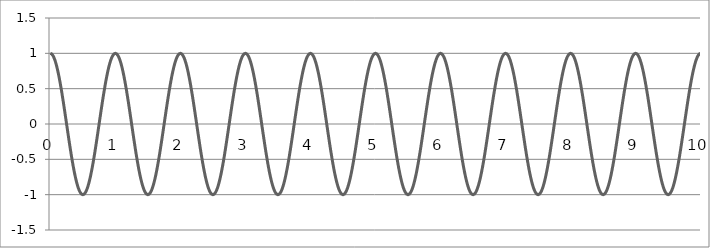
| Category | cos |
|---|---|
| 0.0 | 1 |
| 0.01 | 0.998 |
| 0.02 | 0.992 |
| 0.03 | 0.982 |
| 0.04 | 0.969 |
| 0.05 | 0.951 |
| 0.06 | 0.93 |
| 0.07 | 0.905 |
| 0.08 | 0.876 |
| 0.09 | 0.844 |
| 0.1 | 0.809 |
| 0.11 | 0.771 |
| 0.12 | 0.729 |
| 0.13 | 0.685 |
| 0.14 | 0.637 |
| 0.15 | 0.588 |
| 0.16 | 0.536 |
| 0.17 | 0.482 |
| 0.18 | 0.426 |
| 0.19 | 0.368 |
| 0.2 | 0.309 |
| 0.21 | 0.249 |
| 0.22 | 0.187 |
| 0.23 | 0.125 |
| 0.24 | 0.063 |
| 0.25 | 0 |
| 0.26 | -0.063 |
| 0.27 | -0.125 |
| 0.28 | -0.187 |
| 0.29 | -0.249 |
| 0.3 | -0.309 |
| 0.31 | -0.368 |
| 0.32 | -0.426 |
| 0.33 | -0.482 |
| 0.34 | -0.536 |
| 0.35 | -0.588 |
| 0.36 | -0.637 |
| 0.37 | -0.685 |
| 0.38 | -0.729 |
| 0.39 | -0.771 |
| 0.4 | -0.809 |
| 0.41 | -0.844 |
| 0.42 | -0.876 |
| 0.43 | -0.905 |
| 0.44 | -0.93 |
| 0.45 | -0.951 |
| 0.46 | -0.969 |
| 0.47 | -0.982 |
| 0.48 | -0.992 |
| 0.49 | -0.998 |
| 0.5 | -1 |
| 0.51 | -0.998 |
| 0.52 | -0.992 |
| 0.53 | -0.982 |
| 0.54 | -0.969 |
| 0.55 | -0.951 |
| 0.56 | -0.93 |
| 0.57 | -0.905 |
| 0.58 | -0.876 |
| 0.59 | -0.844 |
| 0.6 | -0.809 |
| 0.61 | -0.771 |
| 0.62 | -0.729 |
| 0.63 | -0.685 |
| 0.64 | -0.637 |
| 0.65 | -0.588 |
| 0.66 | -0.536 |
| 0.67 | -0.482 |
| 0.68 | -0.426 |
| 0.69 | -0.368 |
| 0.7 | -0.309 |
| 0.71 | -0.249 |
| 0.72 | -0.187 |
| 0.73 | -0.125 |
| 0.74 | -0.063 |
| 0.75 | 0 |
| 0.76 | 0.063 |
| 0.77 | 0.125 |
| 0.78 | 0.187 |
| 0.79 | 0.249 |
| 0.8 | 0.309 |
| 0.81 | 0.368 |
| 0.82 | 0.426 |
| 0.83 | 0.482 |
| 0.84 | 0.536 |
| 0.85 | 0.588 |
| 0.86 | 0.637 |
| 0.87 | 0.685 |
| 0.88 | 0.729 |
| 0.89 | 0.771 |
| 0.9 | 0.809 |
| 0.91 | 0.844 |
| 0.92 | 0.876 |
| 0.93 | 0.905 |
| 0.94 | 0.93 |
| 0.95 | 0.951 |
| 0.96 | 0.969 |
| 0.97 | 0.982 |
| 0.98 | 0.992 |
| 0.99 | 0.998 |
| 1.0 | 1 |
| 1.01 | 0.998 |
| 1.02 | 0.992 |
| 1.03 | 0.982 |
| 1.04 | 0.969 |
| 1.05 | 0.951 |
| 1.06 | 0.93 |
| 1.07 | 0.905 |
| 1.08 | 0.876 |
| 1.09 | 0.844 |
| 1.1 | 0.809 |
| 1.11 | 0.771 |
| 1.12 | 0.729 |
| 1.13 | 0.685 |
| 1.14 | 0.637 |
| 1.15 | 0.588 |
| 1.16 | 0.536 |
| 1.17 | 0.482 |
| 1.18 | 0.426 |
| 1.19 | 0.368 |
| 1.2 | 0.309 |
| 1.21 | 0.249 |
| 1.22 | 0.187 |
| 1.23 | 0.125 |
| 1.24 | 0.063 |
| 1.25 | 0 |
| 1.26 | -0.063 |
| 1.27 | -0.125 |
| 1.28 | -0.187 |
| 1.29 | -0.249 |
| 1.3 | -0.309 |
| 1.31 | -0.368 |
| 1.32 | -0.426 |
| 1.33 | -0.482 |
| 1.34 | -0.536 |
| 1.35 | -0.588 |
| 1.36 | -0.637 |
| 1.37 | -0.685 |
| 1.38 | -0.729 |
| 1.39 | -0.771 |
| 1.4 | -0.809 |
| 1.41 | -0.844 |
| 1.42 | -0.876 |
| 1.43 | -0.905 |
| 1.44 | -0.93 |
| 1.45 | -0.951 |
| 1.46 | -0.969 |
| 1.47 | -0.982 |
| 1.48 | -0.992 |
| 1.49 | -0.998 |
| 1.5 | -1 |
| 1.51 | -0.998 |
| 1.52 | -0.992 |
| 1.53 | -0.982 |
| 1.54 | -0.969 |
| 1.55 | -0.951 |
| 1.56 | -0.93 |
| 1.57 | -0.905 |
| 1.58 | -0.876 |
| 1.59 | -0.844 |
| 1.6 | -0.809 |
| 1.61 | -0.771 |
| 1.62 | -0.729 |
| 1.63 | -0.685 |
| 1.64 | -0.637 |
| 1.65 | -0.588 |
| 1.66 | -0.536 |
| 1.67 | -0.482 |
| 1.68 | -0.426 |
| 1.69 | -0.368 |
| 1.7 | -0.309 |
| 1.71 | -0.249 |
| 1.72 | -0.187 |
| 1.73 | -0.125 |
| 1.74 | -0.063 |
| 1.75 | 0 |
| 1.76 | 0.063 |
| 1.77 | 0.125 |
| 1.78 | 0.187 |
| 1.79 | 0.249 |
| 1.8 | 0.309 |
| 1.81 | 0.368 |
| 1.82 | 0.426 |
| 1.83 | 0.482 |
| 1.84 | 0.536 |
| 1.85 | 0.588 |
| 1.86 | 0.637 |
| 1.87 | 0.685 |
| 1.88 | 0.729 |
| 1.89 | 0.771 |
| 1.9 | 0.809 |
| 1.91 | 0.844 |
| 1.92 | 0.876 |
| 1.93 | 0.905 |
| 1.94 | 0.93 |
| 1.95 | 0.951 |
| 1.96 | 0.969 |
| 1.97 | 0.982 |
| 1.98 | 0.992 |
| 1.99 | 0.998 |
| 2.0 | 1 |
| 2.01 | 0.998 |
| 2.02 | 0.992 |
| 2.03 | 0.982 |
| 2.04 | 0.969 |
| 2.05 | 0.951 |
| 2.06 | 0.93 |
| 2.07 | 0.905 |
| 2.08 | 0.876 |
| 2.09 | 0.844 |
| 2.1 | 0.809 |
| 2.11 | 0.771 |
| 2.12 | 0.729 |
| 2.13 | 0.685 |
| 2.14 | 0.637 |
| 2.15 | 0.588 |
| 2.16 | 0.536 |
| 2.17 | 0.482 |
| 2.18 | 0.426 |
| 2.19 | 0.368 |
| 2.2 | 0.309 |
| 2.21 | 0.249 |
| 2.22 | 0.187 |
| 2.23 | 0.125 |
| 2.24 | 0.063 |
| 2.25 | 0 |
| 2.26 | -0.063 |
| 2.27 | -0.125 |
| 2.28 | -0.187 |
| 2.29 | -0.249 |
| 2.3 | -0.309 |
| 2.31 | -0.368 |
| 2.32 | -0.426 |
| 2.33 | -0.482 |
| 2.34 | -0.536 |
| 2.35 | -0.588 |
| 2.36 | -0.637 |
| 2.37 | -0.685 |
| 2.38 | -0.729 |
| 2.39 | -0.771 |
| 2.4 | -0.809 |
| 2.41 | -0.844 |
| 2.42 | -0.876 |
| 2.43 | -0.905 |
| 2.44 | -0.93 |
| 2.45 | -0.951 |
| 2.46 | -0.969 |
| 2.47 | -0.982 |
| 2.48 | -0.992 |
| 2.49 | -0.998 |
| 2.5 | -1 |
| 2.51 | -0.998 |
| 2.52 | -0.992 |
| 2.53 | -0.982 |
| 2.54 | -0.969 |
| 2.55 | -0.951 |
| 2.56 | -0.93 |
| 2.57 | -0.905 |
| 2.58 | -0.876 |
| 2.59 | -0.844 |
| 2.6 | -0.809 |
| 2.61 | -0.771 |
| 2.62 | -0.729 |
| 2.63 | -0.685 |
| 2.64 | -0.637 |
| 2.65 | -0.588 |
| 2.66 | -0.536 |
| 2.67 | -0.482 |
| 2.68 | -0.426 |
| 2.69 | -0.368 |
| 2.7 | -0.309 |
| 2.71 | -0.249 |
| 2.72 | -0.187 |
| 2.73 | -0.125 |
| 2.74 | -0.063 |
| 2.75 | 0 |
| 2.76 | 0.063 |
| 2.77 | 0.125 |
| 2.78 | 0.187 |
| 2.79 | 0.249 |
| 2.8 | 0.309 |
| 2.81 | 0.368 |
| 2.82 | 0.426 |
| 2.83 | 0.482 |
| 2.84 | 0.536 |
| 2.85 | 0.588 |
| 2.86 | 0.637 |
| 2.87 | 0.685 |
| 2.88 | 0.729 |
| 2.89 | 0.771 |
| 2.9 | 0.809 |
| 2.91 | 0.844 |
| 2.92 | 0.876 |
| 2.93 | 0.905 |
| 2.94 | 0.93 |
| 2.95 | 0.951 |
| 2.96 | 0.969 |
| 2.97 | 0.982 |
| 2.98 | 0.992 |
| 2.99 | 0.998 |
| 3.0 | 1 |
| 3.01 | 0.998 |
| 3.02 | 0.992 |
| 3.03 | 0.982 |
| 3.04 | 0.969 |
| 3.05 | 0.951 |
| 3.06 | 0.93 |
| 3.07 | 0.905 |
| 3.08 | 0.876 |
| 3.09 | 0.844 |
| 3.1 | 0.809 |
| 3.11 | 0.771 |
| 3.12 | 0.729 |
| 3.13 | 0.685 |
| 3.14 | 0.637 |
| 3.15 | 0.588 |
| 3.16 | 0.536 |
| 3.17 | 0.482 |
| 3.18 | 0.426 |
| 3.19 | 0.368 |
| 3.2 | 0.309 |
| 3.21 | 0.249 |
| 3.22 | 0.187 |
| 3.23 | 0.125 |
| 3.24 | 0.063 |
| 3.25 | 0 |
| 3.26 | -0.063 |
| 3.27 | -0.125 |
| 3.28 | -0.187 |
| 3.29 | -0.249 |
| 3.3 | -0.309 |
| 3.31 | -0.368 |
| 3.32 | -0.426 |
| 3.33 | -0.482 |
| 3.34 | -0.536 |
| 3.35 | -0.588 |
| 3.36 | -0.637 |
| 3.37 | -0.685 |
| 3.38 | -0.729 |
| 3.39 | -0.771 |
| 3.4 | -0.809 |
| 3.41 | -0.844 |
| 3.42 | -0.876 |
| 3.43 | -0.905 |
| 3.44 | -0.93 |
| 3.45 | -0.951 |
| 3.46 | -0.969 |
| 3.47 | -0.982 |
| 3.48 | -0.992 |
| 3.49 | -0.998 |
| 3.5 | -1 |
| 3.51 | -0.998 |
| 3.52 | -0.992 |
| 3.53 | -0.982 |
| 3.54 | -0.969 |
| 3.55 | -0.951 |
| 3.56 | -0.93 |
| 3.57 | -0.905 |
| 3.58 | -0.876 |
| 3.59 | -0.844 |
| 3.6 | -0.809 |
| 3.61 | -0.771 |
| 3.62 | -0.729 |
| 3.63 | -0.685 |
| 3.64 | -0.637 |
| 3.65 | -0.588 |
| 3.66 | -0.536 |
| 3.67 | -0.482 |
| 3.68 | -0.426 |
| 3.69 | -0.368 |
| 3.7 | -0.309 |
| 3.71 | -0.249 |
| 3.72 | -0.187 |
| 3.73 | -0.125 |
| 3.74 | -0.063 |
| 3.75 | 0 |
| 3.76 | 0.063 |
| 3.77 | 0.125 |
| 3.78 | 0.187 |
| 3.79 | 0.249 |
| 3.8 | 0.309 |
| 3.81 | 0.368 |
| 3.82 | 0.426 |
| 3.83 | 0.482 |
| 3.84 | 0.536 |
| 3.85 | 0.588 |
| 3.86 | 0.637 |
| 3.87 | 0.685 |
| 3.88 | 0.729 |
| 3.89 | 0.771 |
| 3.9 | 0.809 |
| 3.91 | 0.844 |
| 3.92 | 0.876 |
| 3.93 | 0.905 |
| 3.94 | 0.93 |
| 3.95 | 0.951 |
| 3.96 | 0.969 |
| 3.97 | 0.982 |
| 3.98 | 0.992 |
| 3.99 | 0.998 |
| 4.0 | 1 |
| 4.01 | 0.998 |
| 4.02 | 0.992 |
| 4.03 | 0.982 |
| 4.04 | 0.969 |
| 4.05 | 0.951 |
| 4.06 | 0.93 |
| 4.07 | 0.905 |
| 4.08 | 0.876 |
| 4.09 | 0.844 |
| 4.1 | 0.809 |
| 4.11 | 0.771 |
| 4.12 | 0.729 |
| 4.13 | 0.685 |
| 4.14 | 0.637 |
| 4.15 | 0.588 |
| 4.16 | 0.536 |
| 4.17 | 0.482 |
| 4.18 | 0.426 |
| 4.19 | 0.368 |
| 4.2 | 0.309 |
| 4.21 | 0.249 |
| 4.22 | 0.187 |
| 4.23 | 0.125 |
| 4.24 | 0.063 |
| 4.25 | 0 |
| 4.26 | -0.063 |
| 4.27 | -0.125 |
| 4.28 | -0.187 |
| 4.29 | -0.249 |
| 4.3 | -0.309 |
| 4.31 | -0.368 |
| 4.32 | -0.426 |
| 4.33 | -0.482 |
| 4.34 | -0.536 |
| 4.35 | -0.588 |
| 4.36 | -0.637 |
| 4.37 | -0.685 |
| 4.38 | -0.729 |
| 4.39 | -0.771 |
| 4.4 | -0.809 |
| 4.41 | -0.844 |
| 4.42 | -0.876 |
| 4.43 | -0.905 |
| 4.44 | -0.93 |
| 4.45 | -0.951 |
| 4.46 | -0.969 |
| 4.47 | -0.982 |
| 4.48 | -0.992 |
| 4.49 | -0.998 |
| 4.5 | -1 |
| 4.51 | -0.998 |
| 4.52 | -0.992 |
| 4.53 | -0.982 |
| 4.54 | -0.969 |
| 4.55 | -0.951 |
| 4.56 | -0.93 |
| 4.57 | -0.905 |
| 4.58 | -0.876 |
| 4.59 | -0.844 |
| 4.6 | -0.809 |
| 4.61 | -0.771 |
| 4.62 | -0.729 |
| 4.63 | -0.685 |
| 4.64 | -0.637 |
| 4.65 | -0.588 |
| 4.66 | -0.536 |
| 4.67 | -0.482 |
| 4.68 | -0.426 |
| 4.69 | -0.368 |
| 4.7 | -0.309 |
| 4.71 | -0.249 |
| 4.72 | -0.187 |
| 4.73 | -0.125 |
| 4.74 | -0.063 |
| 4.75 | 0 |
| 4.76 | 0.063 |
| 4.77 | 0.125 |
| 4.78 | 0.187 |
| 4.79 | 0.249 |
| 4.8 | 0.309 |
| 4.81 | 0.368 |
| 4.82 | 0.426 |
| 4.83 | 0.482 |
| 4.84 | 0.536 |
| 4.85 | 0.588 |
| 4.86 | 0.637 |
| 4.87 | 0.685 |
| 4.88 | 0.729 |
| 4.89 | 0.771 |
| 4.9 | 0.809 |
| 4.91 | 0.844 |
| 4.92 | 0.876 |
| 4.93 | 0.905 |
| 4.94 | 0.93 |
| 4.95 | 0.951 |
| 4.96 | 0.969 |
| 4.97 | 0.982 |
| 4.98 | 0.992 |
| 4.99 | 0.998 |
| 5.0 | 1 |
| 5.01 | 0.998 |
| 5.02 | 0.992 |
| 5.03 | 0.982 |
| 5.04 | 0.969 |
| 5.05 | 0.951 |
| 5.06 | 0.93 |
| 5.07 | 0.905 |
| 5.08 | 0.876 |
| 5.09 | 0.844 |
| 5.1 | 0.809 |
| 5.11 | 0.771 |
| 5.12 | 0.729 |
| 5.13 | 0.685 |
| 5.14 | 0.637 |
| 5.15 | 0.588 |
| 5.16 | 0.536 |
| 5.17 | 0.482 |
| 5.18 | 0.426 |
| 5.19 | 0.368 |
| 5.2 | 0.309 |
| 5.21 | 0.249 |
| 5.22 | 0.187 |
| 5.23 | 0.125 |
| 5.24 | 0.063 |
| 5.25 | 0 |
| 5.26 | -0.063 |
| 5.27 | -0.125 |
| 5.28 | -0.187 |
| 5.29 | -0.249 |
| 5.3 | -0.309 |
| 5.31 | -0.368 |
| 5.32 | -0.426 |
| 5.33 | -0.482 |
| 5.34 | -0.536 |
| 5.35 | -0.588 |
| 5.36 | -0.637 |
| 5.37 | -0.685 |
| 5.38 | -0.729 |
| 5.39 | -0.771 |
| 5.4 | -0.809 |
| 5.41 | -0.844 |
| 5.42 | -0.876 |
| 5.43 | -0.905 |
| 5.44 | -0.93 |
| 5.45 | -0.951 |
| 5.46 | -0.969 |
| 5.47 | -0.982 |
| 5.48 | -0.992 |
| 5.49 | -0.998 |
| 5.5 | -1 |
| 5.51 | -0.998 |
| 5.52 | -0.992 |
| 5.53 | -0.982 |
| 5.54 | -0.969 |
| 5.55 | -0.951 |
| 5.56 | -0.93 |
| 5.57 | -0.905 |
| 5.58 | -0.876 |
| 5.59 | -0.844 |
| 5.6 | -0.809 |
| 5.61 | -0.771 |
| 5.62 | -0.729 |
| 5.63 | -0.685 |
| 5.64 | -0.637 |
| 5.65 | -0.588 |
| 5.66 | -0.536 |
| 5.67 | -0.482 |
| 5.68 | -0.426 |
| 5.69 | -0.368 |
| 5.7 | -0.309 |
| 5.71 | -0.249 |
| 5.72 | -0.187 |
| 5.73 | -0.125 |
| 5.74 | -0.063 |
| 5.75 | 0 |
| 5.76 | 0.063 |
| 5.77 | 0.125 |
| 5.78 | 0.187 |
| 5.79 | 0.249 |
| 5.8 | 0.309 |
| 5.81 | 0.368 |
| 5.82 | 0.426 |
| 5.83 | 0.482 |
| 5.84 | 0.536 |
| 5.85 | 0.588 |
| 5.86 | 0.637 |
| 5.87 | 0.685 |
| 5.88 | 0.729 |
| 5.89 | 0.771 |
| 5.9 | 0.809 |
| 5.91 | 0.844 |
| 5.92 | 0.876 |
| 5.93 | 0.905 |
| 5.94 | 0.93 |
| 5.95 | 0.951 |
| 5.96 | 0.969 |
| 5.97 | 0.982 |
| 5.98 | 0.992 |
| 5.99 | 0.998 |
| 6.0 | 1 |
| 6.01 | 0.998 |
| 6.02 | 0.992 |
| 6.03 | 0.982 |
| 6.04 | 0.969 |
| 6.05 | 0.951 |
| 6.06 | 0.93 |
| 6.07 | 0.905 |
| 6.08 | 0.876 |
| 6.09 | 0.844 |
| 6.1 | 0.809 |
| 6.11 | 0.771 |
| 6.12 | 0.729 |
| 6.13 | 0.685 |
| 6.14 | 0.637 |
| 6.15 | 0.588 |
| 6.16 | 0.536 |
| 6.17 | 0.482 |
| 6.18 | 0.426 |
| 6.19 | 0.368 |
| 6.2 | 0.309 |
| 6.21 | 0.249 |
| 6.22 | 0.187 |
| 6.23 | 0.125 |
| 6.24 | 0.063 |
| 6.25 | 0 |
| 6.26 | -0.063 |
| 6.27 | -0.125 |
| 6.28 | -0.187 |
| 6.29 | -0.249 |
| 6.3 | -0.309 |
| 6.31 | -0.368 |
| 6.32 | -0.426 |
| 6.33 | -0.482 |
| 6.34 | -0.536 |
| 6.35 | -0.588 |
| 6.36 | -0.637 |
| 6.37 | -0.685 |
| 6.38 | -0.729 |
| 6.39 | -0.771 |
| 6.4 | -0.809 |
| 6.41 | -0.844 |
| 6.42 | -0.876 |
| 6.43 | -0.905 |
| 6.44 | -0.93 |
| 6.45 | -0.951 |
| 6.46 | -0.969 |
| 6.47 | -0.982 |
| 6.48 | -0.992 |
| 6.49 | -0.998 |
| 6.5 | -1 |
| 6.51 | -0.998 |
| 6.52 | -0.992 |
| 6.53 | -0.982 |
| 6.54 | -0.969 |
| 6.55 | -0.951 |
| 6.56 | -0.93 |
| 6.57 | -0.905 |
| 6.58 | -0.876 |
| 6.59 | -0.844 |
| 6.6 | -0.809 |
| 6.61 | -0.771 |
| 6.62 | -0.729 |
| 6.63 | -0.685 |
| 6.64 | -0.637 |
| 6.65 | -0.588 |
| 6.66 | -0.536 |
| 6.67 | -0.482 |
| 6.68 | -0.426 |
| 6.69 | -0.368 |
| 6.7 | -0.309 |
| 6.71 | -0.249 |
| 6.72 | -0.187 |
| 6.73 | -0.125 |
| 6.74 | -0.063 |
| 6.75 | 0 |
| 6.76 | 0.063 |
| 6.77 | 0.125 |
| 6.78 | 0.187 |
| 6.79 | 0.249 |
| 6.8 | 0.309 |
| 6.81 | 0.368 |
| 6.82 | 0.426 |
| 6.83 | 0.482 |
| 6.84 | 0.536 |
| 6.85 | 0.588 |
| 6.86 | 0.637 |
| 6.87 | 0.685 |
| 6.88 | 0.729 |
| 6.89 | 0.771 |
| 6.9 | 0.809 |
| 6.91 | 0.844 |
| 6.92 | 0.876 |
| 6.93 | 0.905 |
| 6.94 | 0.93 |
| 6.95 | 0.951 |
| 6.96 | 0.969 |
| 6.97 | 0.982 |
| 6.98 | 0.992 |
| 6.99 | 0.998 |
| 7.0 | 1 |
| 7.01 | 0.998 |
| 7.02 | 0.992 |
| 7.03 | 0.982 |
| 7.04 | 0.969 |
| 7.05 | 0.951 |
| 7.06 | 0.93 |
| 7.07 | 0.905 |
| 7.08 | 0.876 |
| 7.09 | 0.844 |
| 7.1 | 0.809 |
| 7.11 | 0.771 |
| 7.12 | 0.729 |
| 7.13 | 0.685 |
| 7.14 | 0.637 |
| 7.15 | 0.588 |
| 7.16 | 0.536 |
| 7.17 | 0.482 |
| 7.18 | 0.426 |
| 7.19 | 0.368 |
| 7.2 | 0.309 |
| 7.21 | 0.249 |
| 7.22 | 0.187 |
| 7.23 | 0.125 |
| 7.24 | 0.063 |
| 7.25 | 0 |
| 7.26 | -0.063 |
| 7.27 | -0.125 |
| 7.28 | -0.187 |
| 7.29 | -0.249 |
| 7.3 | -0.309 |
| 7.31 | -0.368 |
| 7.32 | -0.426 |
| 7.33 | -0.482 |
| 7.34 | -0.536 |
| 7.35 | -0.588 |
| 7.36 | -0.637 |
| 7.37 | -0.685 |
| 7.38 | -0.729 |
| 7.39 | -0.771 |
| 7.4 | -0.809 |
| 7.41 | -0.844 |
| 7.42 | -0.876 |
| 7.43 | -0.905 |
| 7.44 | -0.93 |
| 7.45 | -0.951 |
| 7.46 | -0.969 |
| 7.47 | -0.982 |
| 7.48 | -0.992 |
| 7.49 | -0.998 |
| 7.5 | -1 |
| 7.51 | -0.998 |
| 7.52 | -0.992 |
| 7.53 | -0.982 |
| 7.54 | -0.969 |
| 7.55 | -0.951 |
| 7.56 | -0.93 |
| 7.57 | -0.905 |
| 7.58 | -0.876 |
| 7.59 | -0.844 |
| 7.6 | -0.809 |
| 7.61 | -0.771 |
| 7.62 | -0.729 |
| 7.63 | -0.685 |
| 7.64 | -0.637 |
| 7.65 | -0.588 |
| 7.66 | -0.536 |
| 7.67 | -0.482 |
| 7.68 | -0.426 |
| 7.69 | -0.368 |
| 7.7 | -0.309 |
| 7.71 | -0.249 |
| 7.72 | -0.187 |
| 7.73 | -0.125 |
| 7.74 | -0.063 |
| 7.75 | 0 |
| 7.76 | 0.063 |
| 7.77 | 0.125 |
| 7.78 | 0.187 |
| 7.79 | 0.249 |
| 7.8 | 0.309 |
| 7.81 | 0.368 |
| 7.82 | 0.426 |
| 7.83 | 0.482 |
| 7.84 | 0.536 |
| 7.85 | 0.588 |
| 7.86 | 0.637 |
| 7.87 | 0.685 |
| 7.88 | 0.729 |
| 7.89 | 0.771 |
| 7.9 | 0.809 |
| 7.91 | 0.844 |
| 7.92 | 0.876 |
| 7.93 | 0.905 |
| 7.94 | 0.93 |
| 7.95 | 0.951 |
| 7.96 | 0.969 |
| 7.97 | 0.982 |
| 7.98 | 0.992 |
| 7.99 | 0.998 |
| 8.0 | 1 |
| 8.01 | 0.998 |
| 8.02 | 0.992 |
| 8.03 | 0.982 |
| 8.04 | 0.969 |
| 8.05 | 0.951 |
| 8.06 | 0.93 |
| 8.07 | 0.905 |
| 8.08 | 0.876 |
| 8.09 | 0.844 |
| 8.1 | 0.809 |
| 8.11 | 0.771 |
| 8.12 | 0.729 |
| 8.13 | 0.685 |
| 8.14 | 0.637 |
| 8.15 | 0.588 |
| 8.16 | 0.536 |
| 8.17 | 0.482 |
| 8.18 | 0.426 |
| 8.19 | 0.368 |
| 8.2 | 0.309 |
| 8.21 | 0.249 |
| 8.22 | 0.187 |
| 8.23 | 0.125 |
| 8.24 | 0.063 |
| 8.25 | 0 |
| 8.26 | -0.063 |
| 8.27 | -0.125 |
| 8.28 | -0.187 |
| 8.29 | -0.249 |
| 8.3 | -0.309 |
| 8.31 | -0.368 |
| 8.32 | -0.426 |
| 8.33 | -0.482 |
| 8.34 | -0.536 |
| 8.35 | -0.588 |
| 8.36 | -0.637 |
| 8.37 | -0.685 |
| 8.38 | -0.729 |
| 8.39 | -0.771 |
| 8.4 | -0.809 |
| 8.41 | -0.844 |
| 8.42 | -0.876 |
| 8.43 | -0.905 |
| 8.44 | -0.93 |
| 8.45 | -0.951 |
| 8.46 | -0.969 |
| 8.47 | -0.982 |
| 8.48 | -0.992 |
| 8.49 | -0.998 |
| 8.5 | -1 |
| 8.51 | -0.998 |
| 8.52 | -0.992 |
| 8.53 | -0.982 |
| 8.54 | -0.969 |
| 8.55 | -0.951 |
| 8.56 | -0.93 |
| 8.57 | -0.905 |
| 8.58 | -0.876 |
| 8.59 | -0.844 |
| 8.6 | -0.809 |
| 8.61 | -0.771 |
| 8.62 | -0.729 |
| 8.63 | -0.685 |
| 8.64 | -0.637 |
| 8.65 | -0.588 |
| 8.66 | -0.536 |
| 8.67 | -0.482 |
| 8.68 | -0.426 |
| 8.69 | -0.368 |
| 8.7 | -0.309 |
| 8.71 | -0.249 |
| 8.72 | -0.187 |
| 8.73 | -0.125 |
| 8.74 | -0.063 |
| 8.75 | 0 |
| 8.76 | 0.063 |
| 8.77 | 0.125 |
| 8.78 | 0.187 |
| 8.79 | 0.249 |
| 8.8 | 0.309 |
| 8.81 | 0.368 |
| 8.82 | 0.426 |
| 8.83 | 0.482 |
| 8.84 | 0.536 |
| 8.85 | 0.588 |
| 8.86 | 0.637 |
| 8.87 | 0.685 |
| 8.88 | 0.729 |
| 8.89 | 0.771 |
| 8.9 | 0.809 |
| 8.91 | 0.844 |
| 8.92 | 0.876 |
| 8.93 | 0.905 |
| 8.94 | 0.93 |
| 8.95 | 0.951 |
| 8.96 | 0.969 |
| 8.97 | 0.982 |
| 8.98 | 0.992 |
| 8.99 | 0.998 |
| 9.0 | 1 |
| 9.01 | 0.998 |
| 9.02 | 0.992 |
| 9.03 | 0.982 |
| 9.04 | 0.969 |
| 9.05 | 0.951 |
| 9.06 | 0.93 |
| 9.07 | 0.905 |
| 9.08 | 0.876 |
| 9.09 | 0.844 |
| 9.1 | 0.809 |
| 9.11 | 0.771 |
| 9.12 | 0.729 |
| 9.13 | 0.685 |
| 9.14 | 0.637 |
| 9.15 | 0.588 |
| 9.16 | 0.536 |
| 9.17 | 0.482 |
| 9.18 | 0.426 |
| 9.19 | 0.368 |
| 9.2 | 0.309 |
| 9.21 | 0.249 |
| 9.22 | 0.187 |
| 9.23 | 0.125 |
| 9.24 | 0.063 |
| 9.25 | 0 |
| 9.26 | -0.063 |
| 9.27 | -0.125 |
| 9.28 | -0.187 |
| 9.29 | -0.249 |
| 9.3 | -0.309 |
| 9.31 | -0.368 |
| 9.32 | -0.426 |
| 9.33 | -0.482 |
| 9.34 | -0.536 |
| 9.35 | -0.588 |
| 9.36 | -0.637 |
| 9.37 | -0.685 |
| 9.38 | -0.729 |
| 9.39 | -0.771 |
| 9.4 | -0.809 |
| 9.41 | -0.844 |
| 9.42 | -0.876 |
| 9.43 | -0.905 |
| 9.44 | -0.93 |
| 9.45 | -0.951 |
| 9.46 | -0.969 |
| 9.47 | -0.982 |
| 9.48 | -0.992 |
| 9.49 | -0.998 |
| 9.5 | -1 |
| 9.51 | -0.998 |
| 9.52 | -0.992 |
| 9.53 | -0.982 |
| 9.54 | -0.969 |
| 9.55 | -0.951 |
| 9.56 | -0.93 |
| 9.57 | -0.905 |
| 9.58 | -0.876 |
| 9.59 | -0.844 |
| 9.6 | -0.809 |
| 9.61 | -0.771 |
| 9.62 | -0.729 |
| 9.63 | -0.685 |
| 9.64 | -0.637 |
| 9.65 | -0.588 |
| 9.66 | -0.536 |
| 9.67 | -0.482 |
| 9.68 | -0.426 |
| 9.69 | -0.368 |
| 9.7 | -0.309 |
| 9.71 | -0.249 |
| 9.72 | -0.187 |
| 9.73 | -0.125 |
| 9.74 | -0.063 |
| 9.75 | 0 |
| 9.76 | 0.063 |
| 9.77 | 0.125 |
| 9.78 | 0.187 |
| 9.79 | 0.249 |
| 9.8 | 0.309 |
| 9.81 | 0.368 |
| 9.82 | 0.426 |
| 9.83 | 0.482 |
| 9.84 | 0.536 |
| 9.85 | 0.588 |
| 9.86 | 0.637 |
| 9.87 | 0.685 |
| 9.88 | 0.729 |
| 9.89 | 0.771 |
| 9.9 | 0.809 |
| 9.91 | 0.844 |
| 9.92 | 0.876 |
| 9.93 | 0.905 |
| 9.94 | 0.93 |
| 9.95 | 0.951 |
| 9.96 | 0.969 |
| 9.97 | 0.982 |
| 9.98 | 0.992 |
| 9.99 | 0.998 |
| 10.0 | 1 |